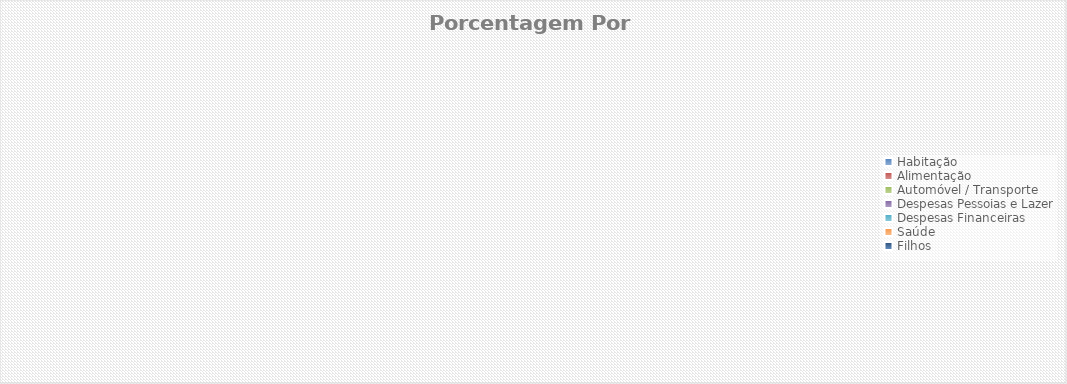
| Category | Porcentagem |
|---|---|
| Habitação | 0 |
| Alimentação | 0 |
| Automóvel / Transporte | 0 |
| Despesas Pessoias e Lazer | 0 |
| Despesas Financeiras | 0 |
| Saúde | 0 |
| Filhos | 0 |